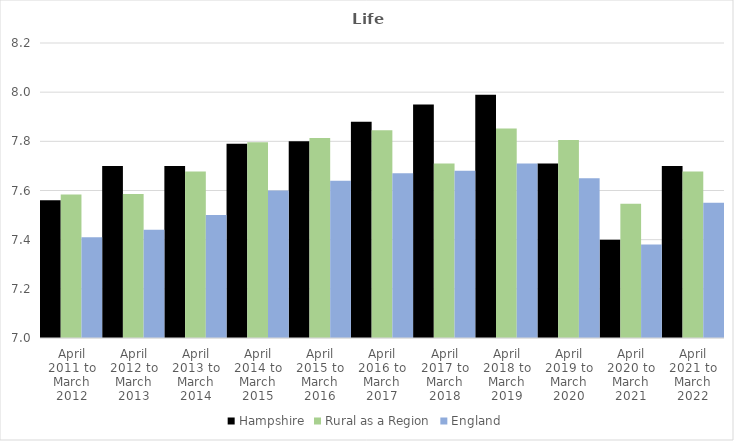
| Category | Hampshire | Rural as a Region | England |
|---|---|---|---|
| April 2011 to March 2012 | 7.56 | 7.584 | 7.41 |
| April 2012 to March 2013 | 7.7 | 7.586 | 7.44 |
| April 2013 to March 2014 | 7.7 | 7.677 | 7.5 |
| April 2014 to March 2015 | 7.79 | 7.797 | 7.6 |
| April 2015 to March 2016 | 7.8 | 7.813 | 7.64 |
| April 2016 to March 2017 | 7.88 | 7.845 | 7.67 |
| April 2017 to March 2018 | 7.95 | 7.71 | 7.68 |
| April 2018 to March 2019 | 7.99 | 7.852 | 7.71 |
| April 2019 to March 2020 | 7.71 | 7.806 | 7.65 |
| April 2020 to March 2021 | 7.4 | 7.546 | 7.38 |
| April 2021 to March 2022 | 7.7 | 7.677 | 7.55 |